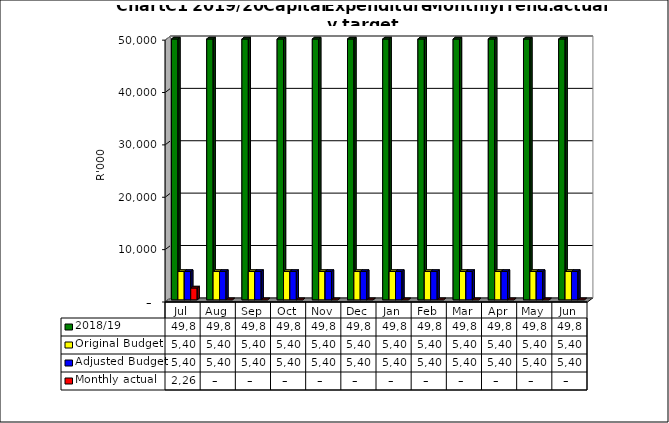
| Category | 2018/19 | Original Budget | Adjusted Budget | Monthly actual |
|---|---|---|---|---|
| Jul | 49810190 | 5407906.33 | 5407906 | 2263488 |
| Aug | 49810190 | 5407906.33 | 5407906 | 0 |
| Sep | 49810190 | 5407906.33 | 5407906 | 0 |
| Oct | 49810190 | 5407906.33 | 5407906 | 0 |
| Nov | 49810190 | 5407906.33 | 5407906 | 0 |
| Dec | 49810190 | 5407906.33 | 5407906 | 0 |
| Jan | 49810190 | 5407906.33 | 5407906 | 0 |
| Feb | 49810190 | 5407906.33 | 5407906 | 0 |
| Mar | 49810190 | 5407906.33 | 5407906 | 0 |
| Apr | 49810190 | 5407906.33 | 5407906 | 0 |
| May | 49810190 | 5407906.33 | 5407906 | 0 |
| Jun | 49810190 | 5407906.33 | 5407910 | 0 |